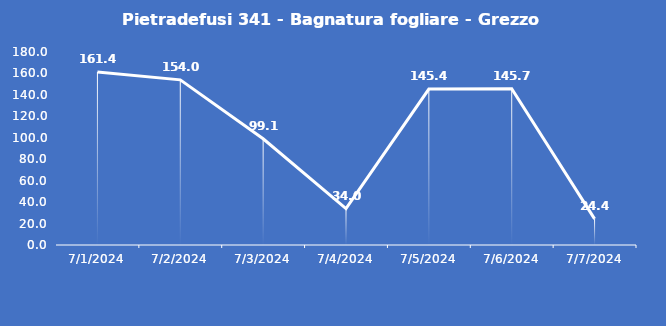
| Category | Pietradefusi 341 - Bagnatura fogliare - Grezzo (min) |
|---|---|
| 7/1/24 | 161.4 |
| 7/2/24 | 154 |
| 7/3/24 | 99.1 |
| 7/4/24 | 34 |
| 7/5/24 | 145.4 |
| 7/6/24 | 145.7 |
| 7/7/24 | 24.4 |